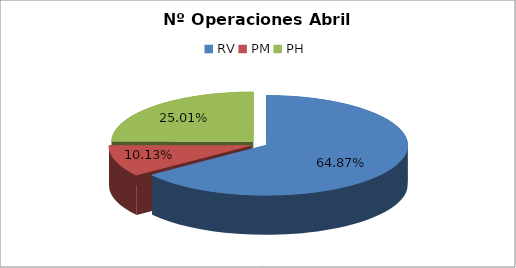
| Category | Series 0 |
|---|---|
| RV | 19898 |
| PM | 3107 |
| PH | 7671 |